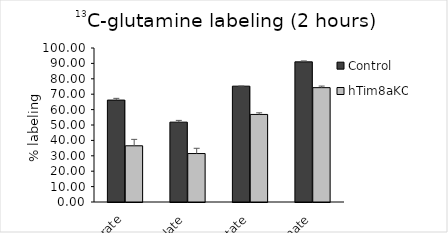
| Category | Control | hTim8aKO |
|---|---|---|
| Fumarate | 66.178 | 36.497 |
| Malate | 51.851 | 31.466 |
| Aspartate | 75.219 | 56.85 |
| Glutamate | 91.009 | 74.249 |